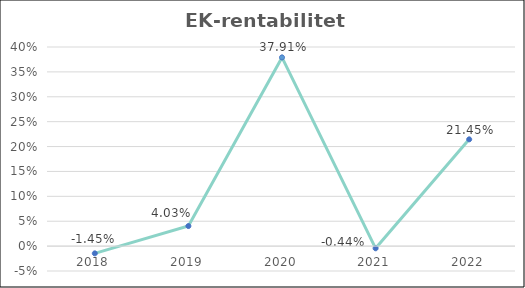
| Category | EK-rentabilitet |
|---|---|
| 2018 | -0.015 |
| 2019 | 0.04 |
| 2020 | 0.379 |
| 2021 | -0.004 |
| 2022 | 0.215 |